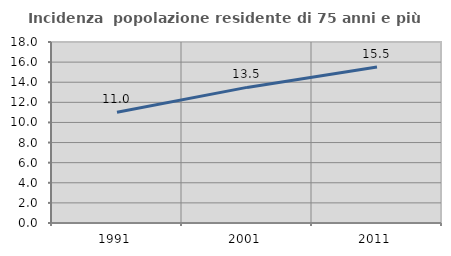
| Category | Incidenza  popolazione residente di 75 anni e più |
|---|---|
| 1991.0 | 11.021 |
| 2001.0 | 13.485 |
| 2011.0 | 15.51 |